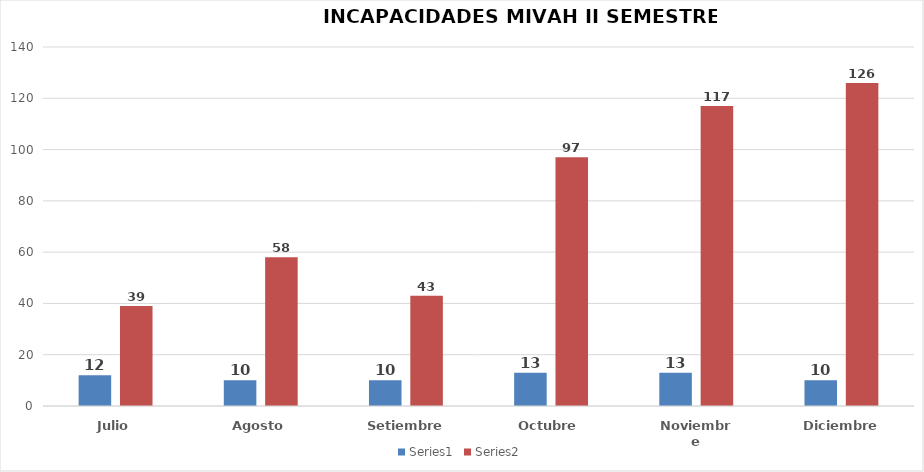
| Category | Series 0 | Series 1 |
|---|---|---|
| Julio | 12 | 39 |
| Agosto | 10 | 58 |
| Setiembre | 10 | 43 |
| Octubre | 13 | 97 |
| Noviembre | 13 | 117 |
| Diciembre | 10 | 126 |